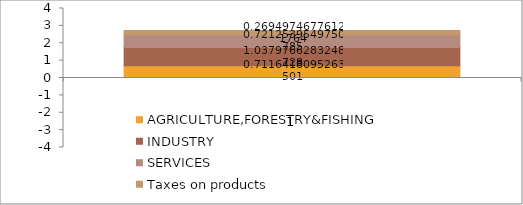
| Category | AGRICULTURE,FORESTRY&FISHING | INDUSTRY | SERVICES | Taxes on products |
|---|---|---|---|---|
| 0 | 0.712 | 1.038 | 0.721 | 0.269 |